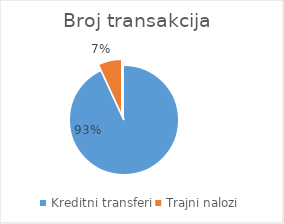
| Category | Broj transakcija  |
|---|---|
| Kreditni transferi | 326255218 |
| Trajni nalozi | 24095970 |